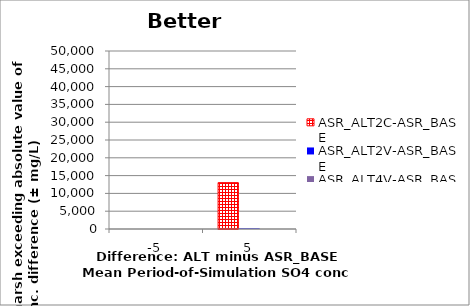
| Category | ASR_ALT2C-ASR_BASE | ASR_ALT2V-ASR_BASE | ASR_ALT4V-ASR_BASE |
|---|---|---|---|
| -5.0 | 0 | 0 | 0 |
| 5.0 | 13025 | 150 | 0 |